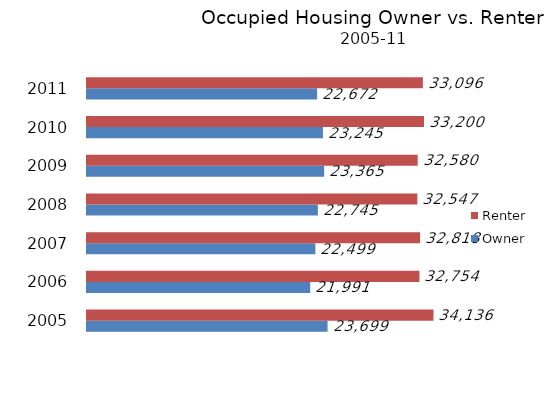
| Category | Owner | Renter |
|---|---|---|
| 2005 | 23699 | 34136 |
| 2006 | 21991 | 32754 |
| 2007 | 22499 | 32818 |
| 2008 | 22745 | 32547 |
| 2009 | 23365 | 32580 |
| 2010 | 23245 | 33200 |
| 2011 | 22672 | 33096 |